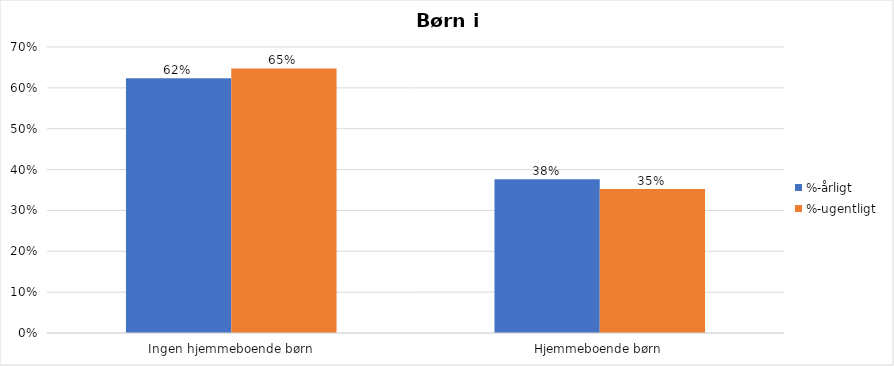
| Category | %-årligt | %-ugentligt |
|---|---|---|
| Ingen hjemmeboende børn | 0.624 | 0.647 |
| Hjemmeboende børn | 0.376 | 0.353 |